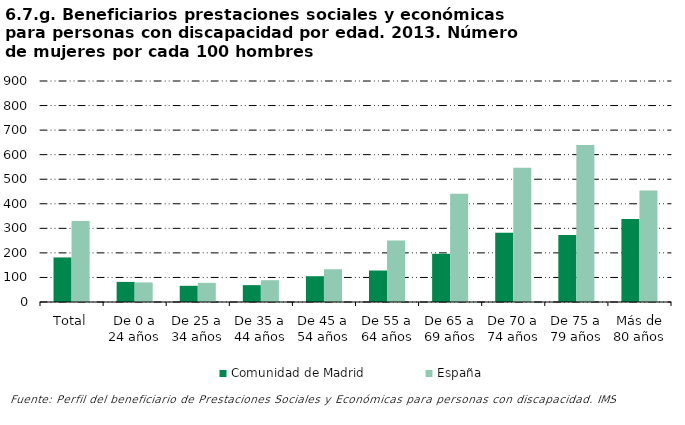
| Category | Comunidad de Madrid | España |
|---|---|---|
| Total | 181.434 | 329.899 |
| De 0 a 24 años | 81.818 | 79.798 |
| De 25 a 34 años | 66 | 78.088 |
| De 35 a 44 años | 68.687 | 88.776 |
| De 45 a 54 años | 104.895 | 133.415 |
| De 55 a 64 años | 128.161 | 250.877 |
| De 65 a 69 años | 196.296 | 440.741 |
| De 70 a 74 años | 281.538 | 546.319 |
| De 75 a 79 años | 272.5 | 639.858 |
| Más de 80 años | 338.514 | 454.081 |